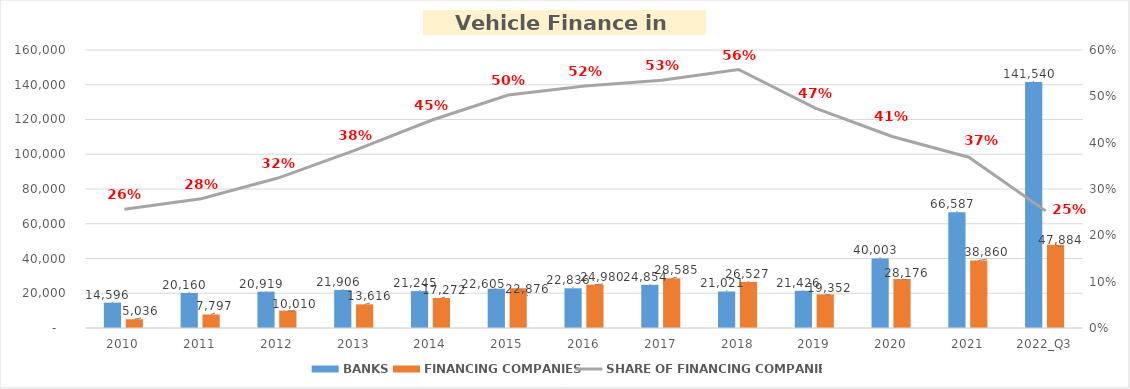
| Category | BANKS | FINANCING COMPANIES |
|---|---|---|
| 2010 | 14595.746 | 5035.89 |
| 2011 | 20160.143 | 7796.854 |
| 2012 | 20919.143 | 10009.755 |
| 2013 | 21905.99 | 13616.036 |
| 2014 | 21244.953 | 17271.844 |
| 2015 | 22605.033 | 22875.563 |
| 2016 | 22835.961 | 24980.231 |
| 2017 | 24853.571 | 28584.938 |
| 2018 | 21021.01 | 26527.133 |
| 2019 | 21426.278 | 19352.327 |
| 2020 | 40002.964 | 28176.3 |
| 2021 | 66586.576 | 38860.099 |
| 2022_Q3 | 141540.287 | 47883.844 |